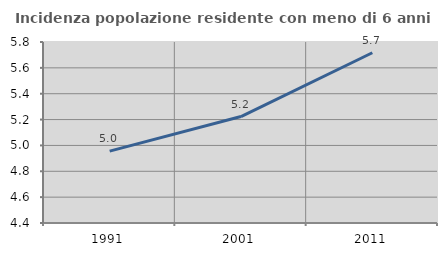
| Category | Incidenza popolazione residente con meno di 6 anni |
|---|---|
| 1991.0 | 4.956 |
| 2001.0 | 5.223 |
| 2011.0 | 5.717 |